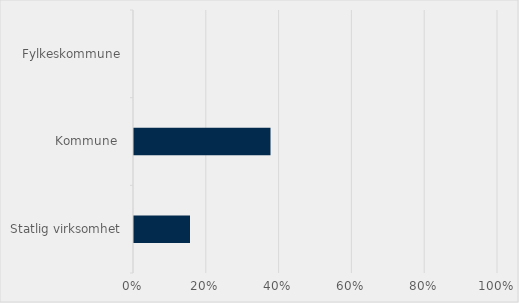
| Category | Prosent |
|---|---|
| Statlig virksomhet | 0.154 |
| Kommune  | 0.375 |
| Fylkeskommune | 0 |